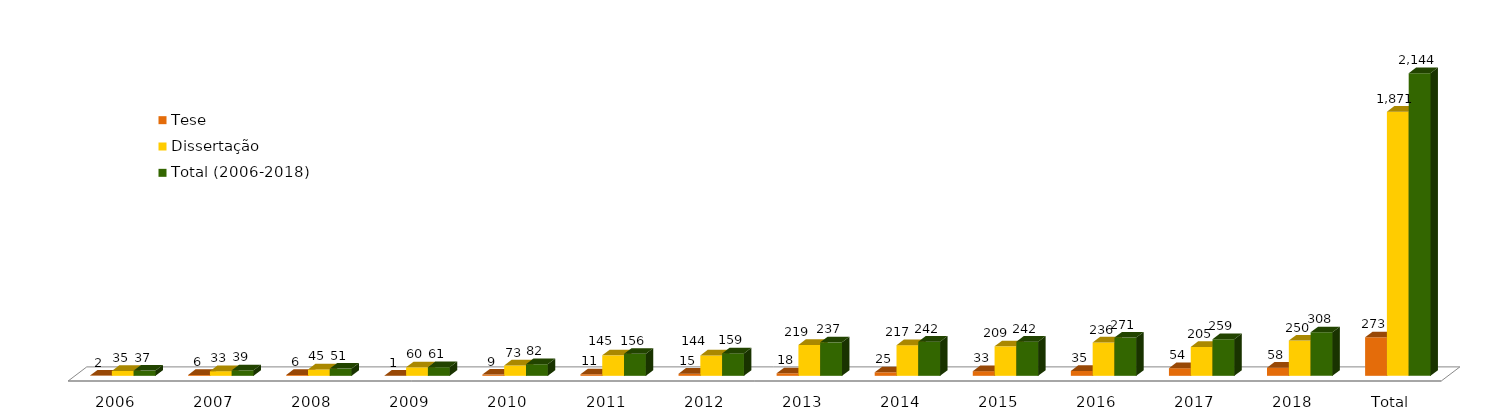
| Category | Tese | Dissertação | Total (2006-2018) |
|---|---|---|---|
| 2006 | 2 | 35 | 37 |
| 2007 | 6 | 33 | 39 |
| 2008 | 6 | 45 | 51 |
| 2009 | 1 | 60 | 61 |
| 2010 | 9 | 73 | 82 |
| 2011 | 11 | 145 | 156 |
| 2012 | 15 | 144 | 159 |
| 2013 | 18 | 219 | 237 |
| 2014 | 25 | 217 | 242 |
| 2015 | 33 | 209 | 242 |
| 2016 | 35 | 236 | 271 |
| 2017 | 54 | 205 | 259 |
| 2018 | 58 | 250 | 308 |
| Total | 273 | 1871 | 2144 |